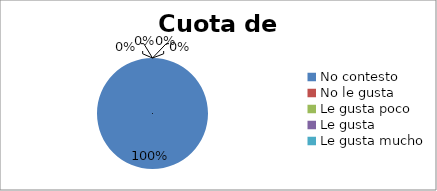
| Category | Series 0 |
|---|---|
| No contesto | 2 |
| No le gusta | 0 |
| Le gusta poco | 0 |
| Le gusta | 0 |
| Le gusta mucho | 0 |